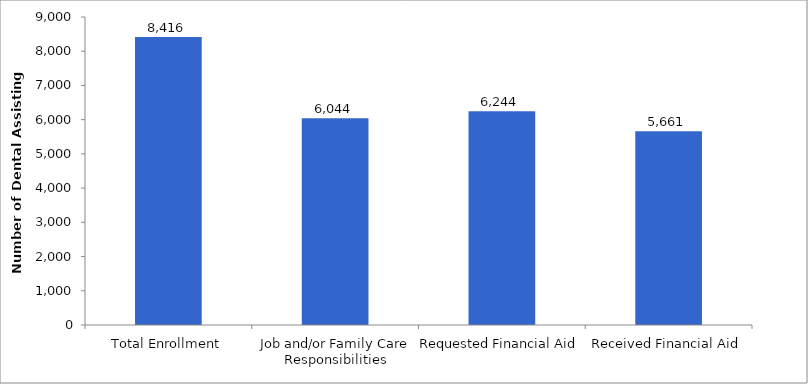
| Category | Series 0 |
|---|---|
| Total Enrollment | 8416 |
| Job and/or Family Care Responsibilities | 6044 |
| Requested Financial Aid | 6244 |
| Received Financial Aid | 5661 |